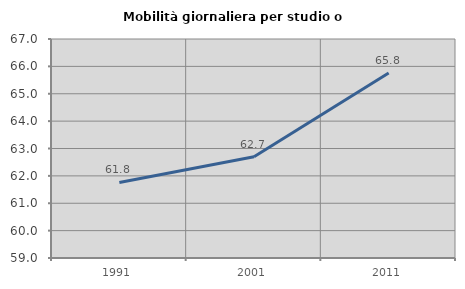
| Category | Mobilità giornaliera per studio o lavoro |
|---|---|
| 1991.0 | 61.759 |
| 2001.0 | 62.701 |
| 2011.0 | 65.76 |